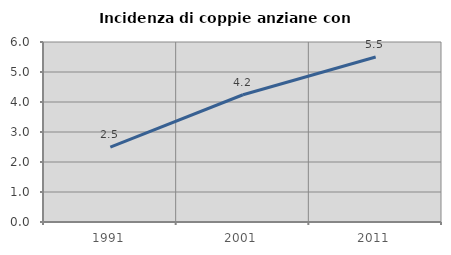
| Category | Incidenza di coppie anziane con figli |
|---|---|
| 1991.0 | 2.494 |
| 2001.0 | 4.241 |
| 2011.0 | 5.498 |